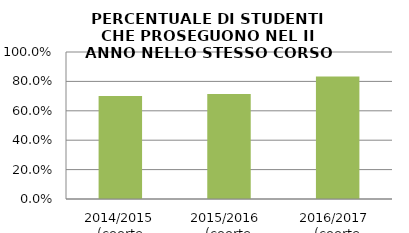
| Category | 2014/2015 (coorte 2013/14) 2015/2016  (coorte 2014/15) 2016/2017  (coorte 2015/16) |
|---|---|
| 2014/2015 (coorte 2013/14) | 0.7 |
| 2015/2016  (coorte 2014/15) | 0.714 |
| 2016/2017  (coorte 2015/16) | 0.833 |